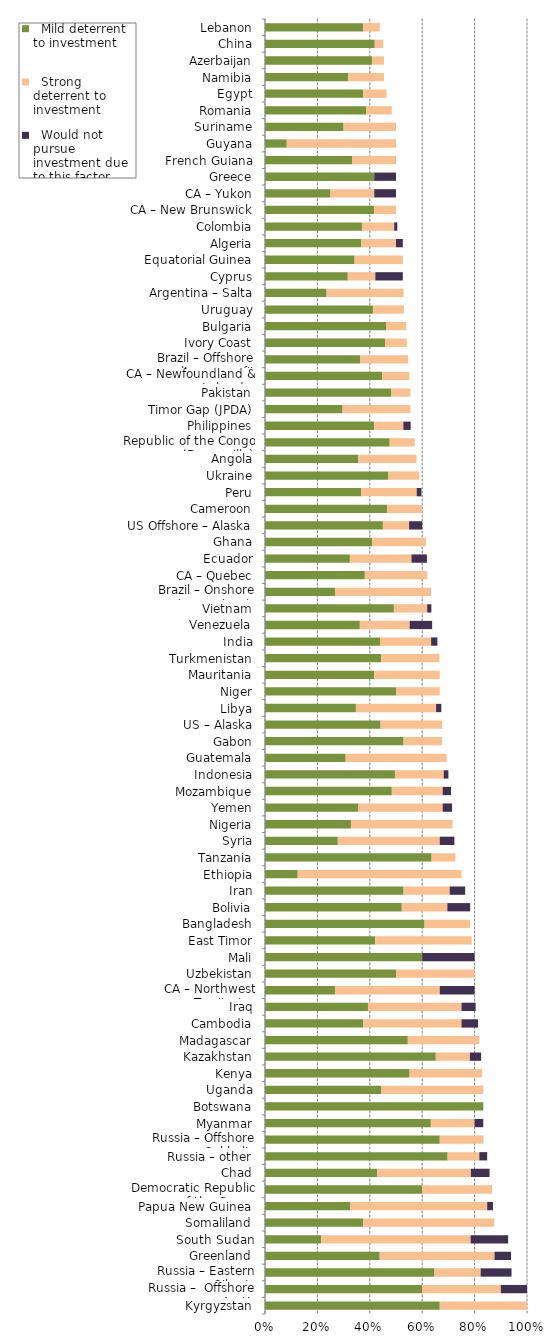
| Category |   Mild deterrent to investment |   Strong deterrent to investment |   Would not pursue investment due to this factor |
|---|---|---|---|
| Kyrgyzstan | 0.667 | 0.333 | 0 |
| Russia –  Offshore Arctic | 0.6 | 0.3 | 0.1 |
| Russia – Eastern Siberia | 0.647 | 0.176 | 0.118 |
| Greenland | 0.438 | 0.438 | 0.063 |
| South Sudan | 0.214 | 0.571 | 0.143 |
| Somaliland | 0.375 | 0.5 | 0 |
| Papua New Guinea | 0.326 | 0.522 | 0.022 |
| Democratic Republic of the Congo (Kinshasa) | 0.6 | 0.267 | 0 |
| Chad | 0.429 | 0.357 | 0.071 |
| Russia – other | 0.697 | 0.121 | 0.03 |
| Russia – Offshore Sakhalin | 0.667 | 0.167 | 0 |
| Myanmar | 0.633 | 0.167 | 0.033 |
| Botswana | 0.833 | 0 | 0 |
| Uganda | 0.444 | 0.389 | 0 |
| Kenya | 0.552 | 0.276 | 0 |
| Kazakhstan | 0.652 | 0.13 | 0.043 |
| Madagascar | 0.545 | 0.273 | 0 |
| Cambodia | 0.375 | 0.375 | 0.063 |
| Iraq | 0.393 | 0.357 | 0.054 |
| CA – Northwest Territories | 0.267 | 0.4 | 0.133 |
| Uzbekistan | 0.5 | 0.3 | 0 |
| Mali | 0.6 | 0 | 0.2 |
| East Timor | 0.421 | 0.368 | 0 |
| Bangladesh | 0.609 | 0.174 | 0 |
| Bolivia | 0.522 | 0.174 | 0.087 |
| Iran | 0.529 | 0.176 | 0.059 |
| Ethiopia | 0.125 | 0.625 | 0 |
| Tanzania | 0.636 | 0.091 | 0 |
| Syria | 0.278 | 0.389 | 0.056 |
| Nigeria | 0.328 | 0.388 | 0 |
| Yemen | 0.357 | 0.321 | 0.036 |
| Mozambique | 0.484 | 0.194 | 0.032 |
| Indonesia | 0.496 | 0.186 | 0.018 |
| Guatemala | 0.308 | 0.385 | 0 |
| Gabon | 0.529 | 0.147 | 0 |
| US – Alaska | 0.441 | 0.235 | 0 |
| Libya | 0.347 | 0.306 | 0.02 |
| Niger | 0.5 | 0.167 | 0 |
| Mauritania | 0.417 | 0.25 | 0 |
| Turkmenistan | 0.444 | 0.222 | 0 |
| India | 0.439 | 0.195 | 0.024 |
| Venezuela | 0.362 | 0.19 | 0.086 |
| Vietnam | 0.492 | 0.127 | 0.016 |
| Brazil – Onshore concession contracts | 0.267 | 0.367 | 0 |
| CA – Quebec | 0.381 | 0.238 | 0 |
| Ecuador | 0.324 | 0.235 | 0.059 |
| Ghana | 0.409 | 0.205 | 0 |
| US Offshore – Alaska | 0.45 | 0.1 | 0.05 |
| Cameroon | 0.467 | 0.133 | 0 |
| Peru | 0.368 | 0.211 | 0.018 |
| Ukraine | 0.471 | 0.118 | 0 |
| Angola | 0.356 | 0.222 | 0 |
| Republic of the Congo (Brazzaville) | 0.476 | 0.095 | 0 |
| Philippines | 0.417 | 0.111 | 0.028 |
| Timor Gap (JPDA) | 0.296 | 0.259 | 0 |
| Pakistan | 0.481 | 0.074 | 0 |
| CA – Newfoundland & Labrador | 0.448 | 0.103 | 0 |
| Brazil – Offshore presalt area profit sharing contracts | 0.364 | 0.182 | 0 |
| Ivory Coast | 0.458 | 0.083 | 0 |
| Bulgaria | 0.462 | 0.077 | 0 |
| Uruguay | 0.412 | 0.118 | 0 |
| Argentina – Salta | 0.235 | 0.294 | 0 |
| Cyprus | 0.316 | 0.105 | 0.105 |
| Equatorial Guinea | 0.342 | 0.184 | 0 |
| Algeria | 0.368 | 0.132 | 0.026 |
| Colombia | 0.37 | 0.123 | 0.012 |
| CA – New Brunswick | 0.417 | 0.083 | 0 |
| CA – Yukon | 0.25 | 0.167 | 0.083 |
| Greece | 0.417 | 0 | 0.083 |
| French Guiana | 0.333 | 0.167 | 0 |
| Guyana | 0.083 | 0.417 | 0 |
| Suriname | 0.3 | 0.2 | 0 |
| Romania | 0.387 | 0.097 | 0 |
| Egypt | 0.375 | 0.089 | 0 |
| Namibia | 0.318 | 0.136 | 0 |
| Azerbaijan | 0.409 | 0.045 | 0 |
| China | 0.419 | 0.032 | 0 |
| Lebanon | 0.375 | 0.063 | 0 |